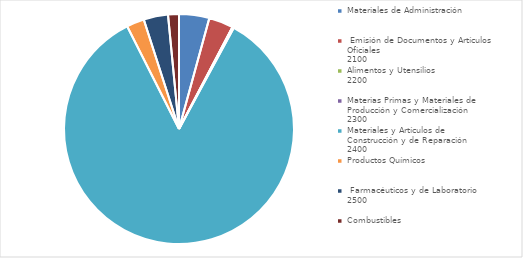
| Category | Importe |
|---|---|
| 0 | 113261674 |
| 1 | 91667562 |
| 2 | 16777 |
| 3 | 5560589 |
| 4 | 2255017046.88 |
| 5 | 66097359.68 |
| 6 | 91309685 |
| 7 | 40686685 |